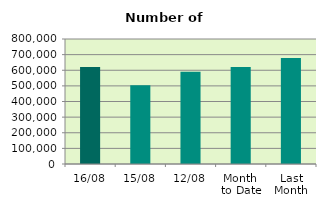
| Category | Series 0 |
|---|---|
| 16/08 | 620610 |
| 15/08 | 504358 |
| 12/08 | 589758 |
| Month 
to Date | 621437.167 |
| Last
Month | 677996.667 |